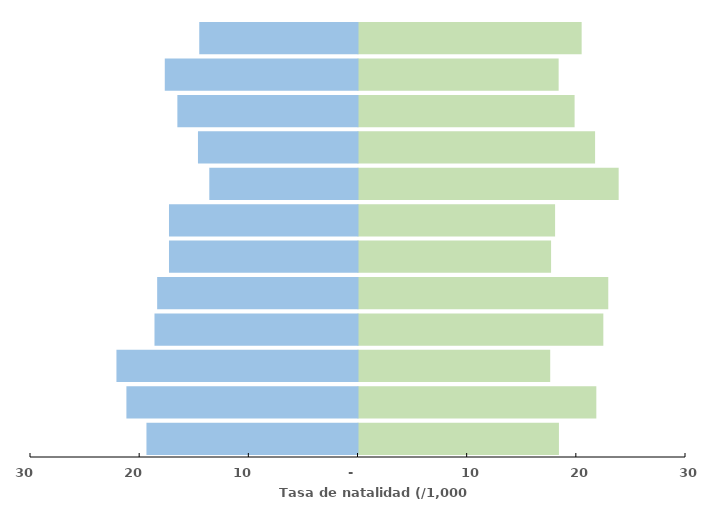
| Category | México | EUA |
|---|---|---|
| Brownsville (Cameron) | 18.361 | -19.332 |
| McAllen (Hidalgo) | 21.786 | -21.169 |
| Laredo (webb) | 17.561 | -22.081 |
| Eagle Pass (Maverick) | 22.427 | -18.596 |
| Del Rio (Valverde) | 22.88 | -18.351 |
| Presidio | 17.64 | -17.268 |
| El Paso | 18.008 | -17.267 |
| Cochise | 23.832 | -13.575 |
| Nogales (Santa Cruz) | 21.671 | -14.614 |
| Yuma | 19.795 | -16.501 |
| Imperial | 18.333 | -17.653 |
| San Diego | 20.44 | -14.495 |